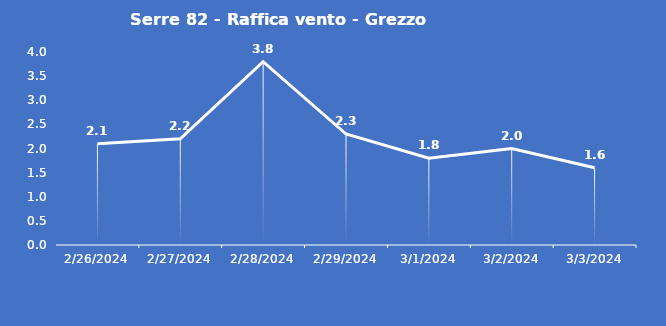
| Category | Serre 82 - Raffica vento - Grezzo (m/s) |
|---|---|
| 2/26/24 | 2.1 |
| 2/27/24 | 2.2 |
| 2/28/24 | 3.8 |
| 2/29/24 | 2.3 |
| 3/1/24 | 1.8 |
| 3/2/24 | 2 |
| 3/3/24 | 1.6 |